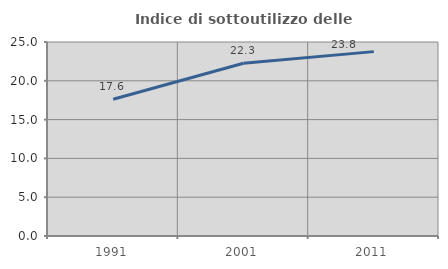
| Category | Indice di sottoutilizzo delle abitazioni  |
|---|---|
| 1991.0 | 17.614 |
| 2001.0 | 22.257 |
| 2011.0 | 23.76 |